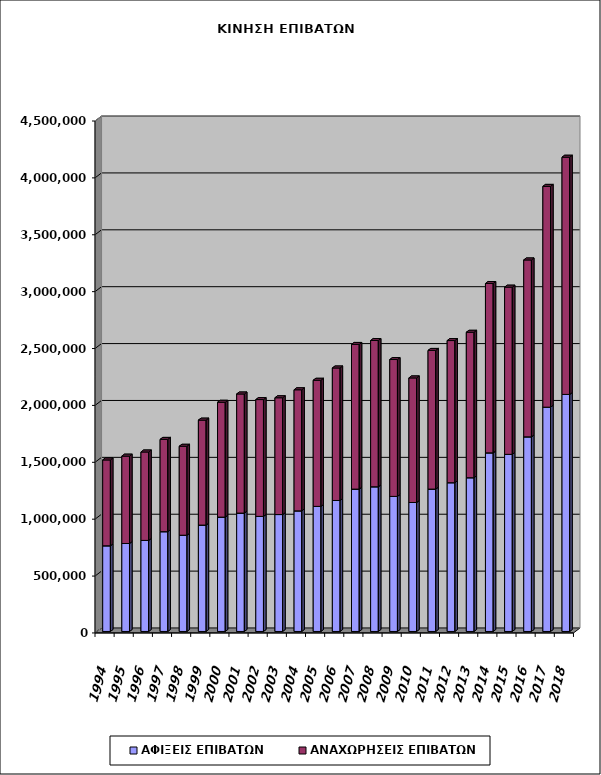
| Category | ΑΦΙΞΕΙΣ ΕΠΙΒΑΤΩΝ | ΑΝΑΧΩΡΗΣΕΙΣ ΕΠΙΒΑΤΩΝ |
|---|---|---|
| 1994.0 | 753040 | 754601 |
| 1995.0 | 773275 | 767859 |
| 1996.0 | 800500 | 777202 |
| 1997.0 | 877037 | 811393 |
| 1998.0 | 846092 | 781834 |
| 1999.0 | 935030 | 922715 |
| 2000.0 | 1005051 | 1009593 |
| 2001.0 | 1040545 | 1046908 |
| 2002.0 | 1011462 | 1026911 |
| 2003.0 | 1027767 | 1026478 |
| 2004.0 | 1060064 | 1064434 |
| 2005.0 | 1099516 | 1108560 |
| 2006.0 | 1151395 | 1164626 |
| 2007.0 | 1251308 | 1271711 |
| 2008.0 | 1271776 | 1285900 |
| 2009.0 | 1187233 | 1203072 |
| 2010.0 | 1133704 | 1094976 |
| 2011.0 | 1251433 | 1219070 |
| 2012.0 | 1307537 | 1249551 |
| 2013.0 | 1351378 | 1278590 |
| 2014.0 | 1569814 | 1488894 |
| 2015.0 | 1556788 | 1469732 |
| 2016.0 | 1710606 | 1554997 |
| 2017.0 | 1971612 | 1940763 |
| 2018.0 | 2083619 | 2085033 |